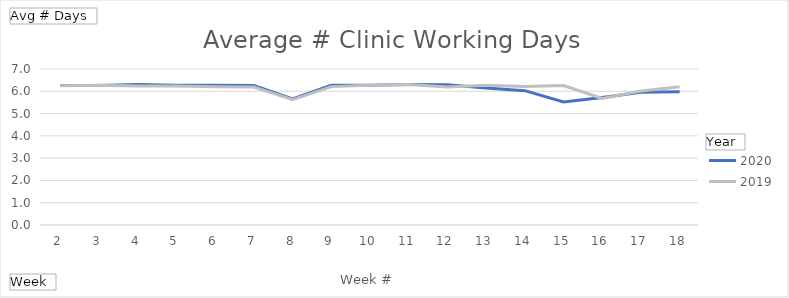
| Category | 2020 | 2019 |
|---|---|---|
| 2 | 6.257 | 6.248 |
| 3 | 6.257 | 6.276 |
| 4 | 6.305 | 6.238 |
| 5 | 6.267 | 6.238 |
| 6 | 6.267 | 6.2 |
| 7 | 6.257 | 6.19 |
| 8 | 5.657 | 5.629 |
| 9 | 6.267 | 6.21 |
| 10 | 6.276 | 6.276 |
| 11 | 6.305 | 6.305 |
| 12 | 6.295 | 6.19 |
| 13 | 6.143 | 6.276 |
| 14 | 6.029 | 6.219 |
| 15 | 5.519 | 6.257 |
| 16 | 5.725 | 5.676 |
| 17 | 5.961 | 6.01 |
| 18 | 5.98 | 6.2 |